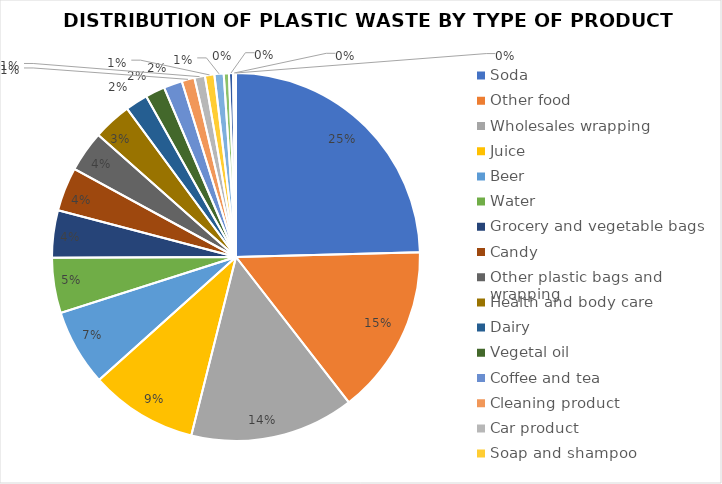
| Category | Series 0 |
|---|---|
| Soda | 3334 |
| Other food | 2022 |
| Wholesales wrapping | 1955 |
| Juice | 1281 |
| Beer | 913 |
| Water | 658 |
| Grocery and vegetable bags | 563 |
| Candy | 522 |
| Other plastic bags and wrapping | 488 |
| Health and body care | 458 |
| Dairy | 268 |
| Vegetal oil | 233 |
| Coffee and tea | 221 |
| Cleaning product | 153 |
| Car product | 125 |
| Soap and shampoo | 113 |
| Other items (non-packaging) | 110 |
| Protective plastic | 62 |
| Other goods | 48 |
| Praying oil | 26 |
| Veterinary product | 9 |